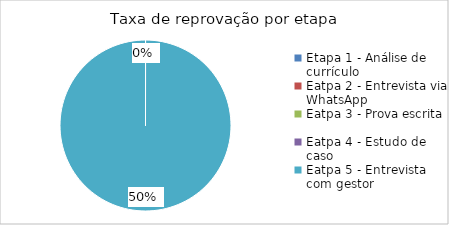
| Category | taxa de reprovações |
|---|---|
| Etapa 1 - Análise de currículo | 0 |
| Eatpa 2 - Entrevista via WhatsApp | 0 |
| Eatpa 3 - Prova escrita | 0 |
| Eatpa 4 - Estudo de caso | 0 |
| Eatpa 5 - Entrevista com gestor | 0.5 |